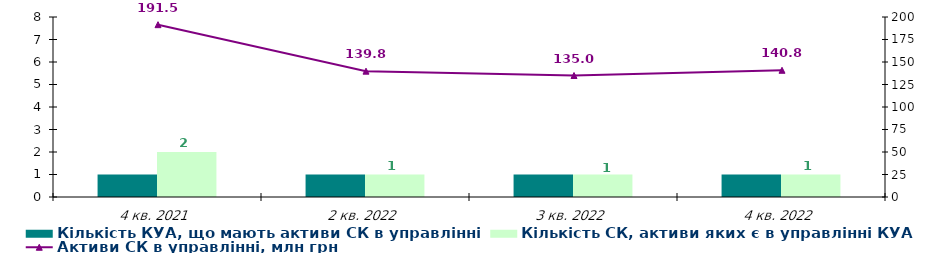
| Category | Кількість КУА, що мають активи СК в управлінні | Кількість СК, активи яких є в управлінні КУА |
|---|---|---|
| 4 кв. 2021 | 1 | 2 |
| 2 кв. 2022 | 1 | 1 |
| 3 кв. 2022 | 1 | 1 |
| 4 кв. 2022 | 1 | 1 |